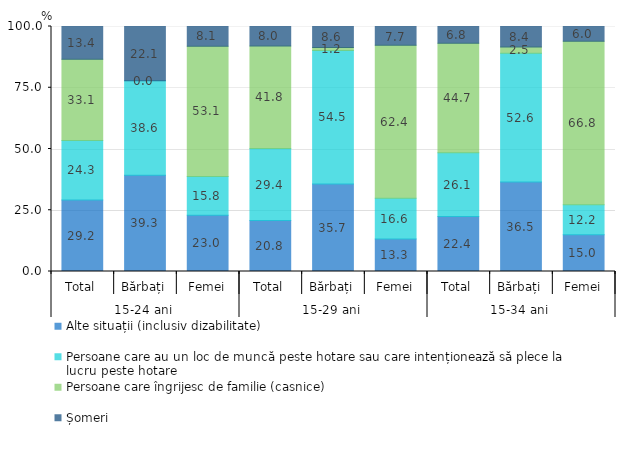
| Category | Alte situații (inclusiv dizabilitate) | Persoane care au un loc de muncă peste hotare sau care intenționează să plece la lucru peste hotare | Persoane care îngrijesc de familie (casnice) | Șomeri |
|---|---|---|---|---|
| 0 | 29.2 | 24.3 | 33.1 | 13.4 |
| 1 | 39.3 | 38.6 | 0 | 22.1 |
| 2 | 23 | 15.8 | 53.1 | 8.1 |
| 3 | 20.8 | 29.4 | 41.8 | 8 |
| 4 | 35.7 | 54.5 | 1.2 | 8.6 |
| 5 | 13.3 | 16.6 | 62.4 | 7.7 |
| 6 | 22.4 | 26.1 | 44.7 | 6.8 |
| 7 | 36.5 | 52.6 | 2.5 | 8.4 |
| 8 | 15 | 12.2 | 66.8 | 6 |